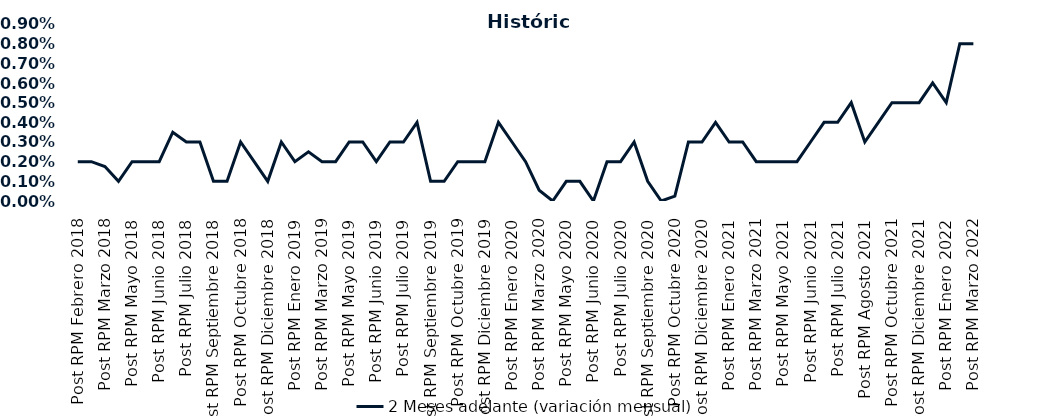
| Category | 2 Meses adelante (variación mensual) |
|---|---|
| Post RPM Febrero 2018 | 0.002 |
| Pre RPM Marzo 2018 | 0.002 |
| Post RPM Marzo 2018 | 0.002 |
| Pre RPM Mayo 2018 | 0.001 |
| Post RPM Mayo 2018 | 0.002 |
| Pre RPM Junio 2018 | 0.002 |
| Post RPM Junio 2018 | 0.002 |
| Pre RPM Julio 2018 | 0.004 |
| Post RPM Julio 2018 | 0.003 |
| Pre RPM Septiembre 2018 | 0.003 |
| Post RPM Septiembre 2018 | 0.001 |
| Pre RPM Octubre 2018 | 0.001 |
| Post RPM Octubre 2018 | 0.003 |
| Pre RPM Diciembre 2018 | 0.002 |
| Post RPM Diciembre 2018 | 0.001 |
| Pre RPM Enero 2019 | 0.003 |
| Post RPM Enero 2019 | 0.002 |
| Pre RPM Marzo 2019 | 0.002 |
| Post RPM Marzo 2019 | 0.002 |
| Pre RPM Mayo 2019 | 0.002 |
| Post RPM Mayo 2019 | 0.003 |
| Pre RPM Junio 2019 | 0.003 |
| Post RPM Junio 2019 | 0.002 |
| Pre RPM Julio 2019 | 0.003 |
| Post RPM Julio 2019 | 0.003 |
| Pre RPM Septiembre 2019 | 0.004 |
| Post RPM Septiembre 2019 | 0.001 |
| Pre RPM Octubre 2019 | 0.001 |
| Post RPM Octubre 2019 | 0.002 |
| Pre RPM Diciembre 2019 | 0.002 |
| Post RPM Diciembre 2019 | 0.002 |
| Pre RPM Enero 2020 | 0.004 |
| Post RPM Enero 2020 | 0.003 |
| Pre RPM Marzo 2020 | 0.002 |
| Post RPM Marzo 2020 | 0.001 |
| Pre RPM Mayo 2020 | 0 |
| Post RPM Mayo 2020 | 0.001 |
| Pre RPM Junio 2020 | 0.001 |
| Post RPM Junio 2020 | 0 |
| Pre RPM Julio 2020 | 0.002 |
| Post RPM Julio 2020 | 0.002 |
| Pre RPM Septiembre 2020 | 0.003 |
| Post RPM Septiembre 2020 | 0.001 |
| Pre RPM Octubre 2020 | 0 |
| Post RPM Octubre 2020 | 0 |
| Pre RPM Diciembre 2020 | 0.003 |
| Post RPM Diciembre 2020 | 0.003 |
| Pre RPM Enero 2021 | 0.004 |
| Post RPM Enero 2021 | 0.003 |
| Pre RPM Marzo 2021 | 0.003 |
| Post RPM Marzo 2021 | 0.002 |
| Pre RPM Mayo 2021 | 0.002 |
| Post RPM Mayo 2021 | 0.002 |
| Pre RPM Junio 2021 | 0.002 |
| Post RPM Junio 2021 | 0.003 |
| Pre RPM Julio 2021 | 0.004 |
| Post RPM Julio 2021 | 0.004 |
| Pre RPM Agosto 2021 | 0.005 |
| Post RPM Agosto 2021 | 0.003 |
| Pre RPM Octubre 2021 | 0.004 |
| Post RPM Octubre 2021 | 0.005 |
| Pre RPM Diciembre 2021 | 0.005 |
| Post RPM Diciembre 2021 | 0.005 |
| Pre RPM Enero 2022 | 0.006 |
| Post RPM Enero 2022 | 0.005 |
| Pre RPM Marzo 2022 | 0.008 |
| Post RPM Marzo 2022 | 0.008 |